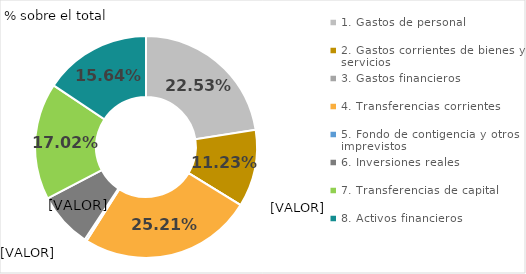
| Category | Series 0 |
|---|---|
| 1. Servicios públicos básicos | 0.109 |
| 2. Actuaciones de protección y promoción social | 0.121 |
| 3. Producción de bienes públicos de carácter preferente | 0.161 |
| 4. Actuaciones de carácter económico  | 0.148 |
| 9. Actuaciones de carácter general | 0.461 |